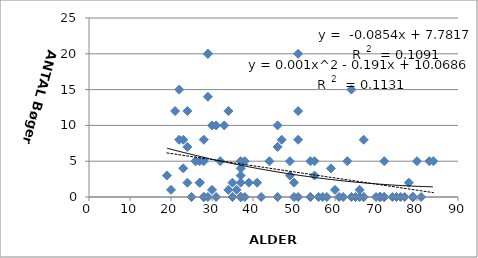
| Category | Series 0 |
|---|---|
| 35.0 | 0 |
| 51.0 | 20 |
| 57.0 | 0 |
| 58.0 | 0 |
| 28.0 | 5 |
| 36.0 | 1 |
| 37.0 | 0 |
| 67.0 | 8 |
| 79.0 | 0 |
| 84.0 | 5 |
| 27.0 | 2 |
| 72.0 | 0 |
| 37.0 | 2 |
| 72.0 | 0 |
| 29.0 | 20 |
| 29.0 | 14 |
| 64.0 | 15 |
| 54.0 | 5 |
| 32.0 | 5 |
| 79.0 | 0 |
| 34.0 | 12 |
| 71.0 | 0 |
| 56.0 | 0 |
| 46.0 | 10 |
| 20.0 | 1 |
| 37.0 | 0 |
| 22.0 | 15 |
| 21.0 | 12 |
| 30.0 | 10 |
| 23.0 | 4 |
| 31.0 | 0 |
| 65.0 | 0 |
| 63.0 | 5 |
| 28.0 | 0 |
| 25.0 | 0 |
| 72.0 | 5 |
| 66.0 | 0 |
| 44.0 | 5 |
| 41.0 | 2 |
| 76.0 | 0 |
| 49.0 | 3 |
| 37.0 | 0 |
| 28.0 | 8 |
| 46.0 | 0 |
| 29.0 | 0 |
| 42.0 | 0 |
| 35.0 | 0 |
| 37.0 | 3 |
| 19.0 | 3 |
| 77.0 | 0 |
| 39.0 | 2 |
| 71.0 | 0 |
| 33.0 | 10 |
| 29.0 | 20 |
| 51.0 | 0 |
| 49.0 | 5 |
| 70.0 | 0 |
| 26.0 | 5 |
| 75.0 | 0 |
| 66.0 | 0 |
| 55.0 | 3 |
| 59.0 | 4 |
| 38.0 | 0 |
| 78.0 | 2 |
| 50.0 | 0 |
| 51.0 | 12 |
| 66.0 | 1 |
| 37.0 | 5 |
| 31.0 | 10 |
| 62.0 | 0 |
| 74.0 | 0 |
| 24.0 | 2 |
| 51.0 | 8 |
| 79.0 | 0 |
| 81.0 | 0 |
| 61.0 | 0 |
| 24.0 | 12 |
| 71.0 | 0 |
| 80.0 | 5 |
| 67.0 | 0 |
| 30.0 | 1 |
| 37.0 | 4 |
| 26.0 | 5 |
| 35.0 | 2 |
| 24.0 | 7 |
| 22.0 | 8 |
| 83.0 | 5 |
| 46.0 | 7 |
| 38.0 | 5 |
| 64.0 | 0 |
| 55.0 | 5 |
| 50.0 | 2 |
| 28.0 | 0 |
| 34.0 | 1 |
| 54.0 | 0 |
| 60.0 | 1 |
| 27.0 | 5 |
| 37.0 | 0 |
| 67.0 | 0 |
| 23.0 | 8 |
| 27.0 | 2 |
| 47.0 | 8 |
| 54.0 | 0 |